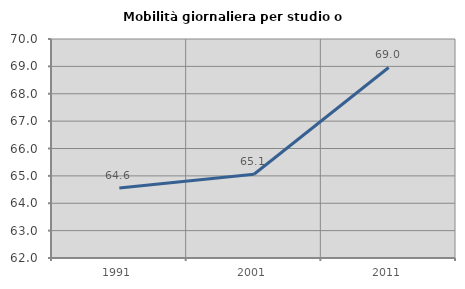
| Category | Mobilità giornaliera per studio o lavoro |
|---|---|
| 1991.0 | 64.559 |
| 2001.0 | 65.058 |
| 2011.0 | 68.96 |